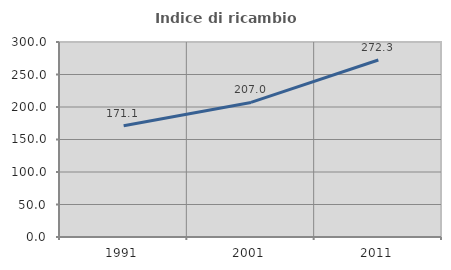
| Category | Indice di ricambio occupazionale  |
|---|---|
| 1991.0 | 171.081 |
| 2001.0 | 207.013 |
| 2011.0 | 272.311 |